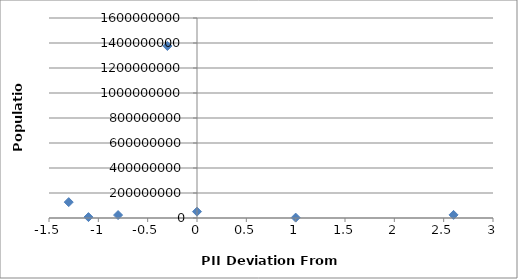
| Category | Population |
|---|---|
| -0.2999999999999998 | 1376049000 |
| -1.0999999999999996 | 7234800 |
| -1.2999999999999998 | 126919659 |
| 2.6000000000000005 | 24895000 |
| 0.0 | 50801405 |
| 1.0 | 3081677 |
| -0.7999999999999998 | 23476640 |